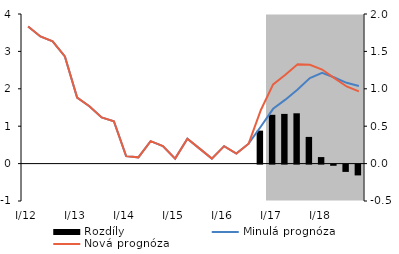
| Category | Rozdíly |
|---|---|
| I/12 | 0 |
| II | 0 |
| III | 0 |
| IV | 0 |
| I/13 | 0 |
| II | 0 |
| III | 0 |
| IV | 0 |
| I/14 | 0 |
| II | 0 |
| III | 0 |
| IV | 0 |
| I/15 | 0 |
| II | 0 |
| III | 0 |
| IV | 0 |
| I/16 | 0 |
| II | 0 |
| III | 0 |
| IV | 0.441 |
| I/17 | 0.652 |
| II | 0.664 |
| III | 0.673 |
| IV | 0.357 |
| I/18 | 0.087 |
| II | -0.016 |
| III | -0.098 |
| IV | -0.145 |